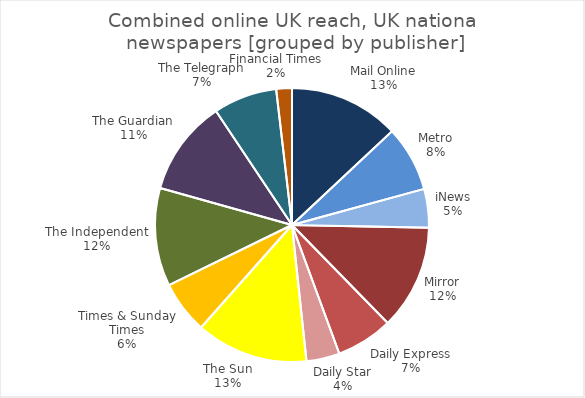
| Category | Series 0 |
|---|---|
| Mail Online | 23.9 |
| Metro | 14.2 |
| iNews | 8.4 |
| Mirror | 22.7 |
| Daily Express | 12.3 |
| Daily Star | 7.2 |
| The Sun | 24.3 |
| Times & Sunday Times | 11.4 |
| The Independent | 21.3 |
| The Guardian | 20.7 |
| The Telegraph | 13.8 |
| Financial Times | 3.4 |